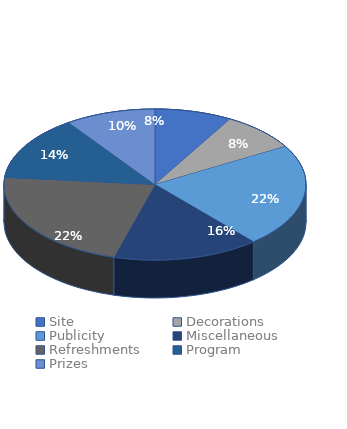
| Category | 3617 |
|---|---|
| Site | 300 |
| Decorations | 300 |
| Publicity | 800 |
| Miscellaneous | 567 |
| Refreshments | 800 |
| Program | 500 |
| Prizes | 350 |